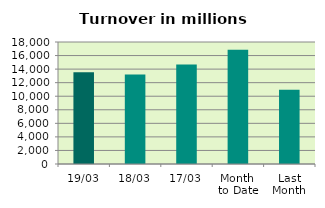
| Category | Series 0 |
|---|---|
| 19/03 | 13555.21 |
| 18/03 | 13217.197 |
| 17/03 | 14692.088 |
| Month 
to Date | 16853.34 |
| Last
Month | 10948.033 |